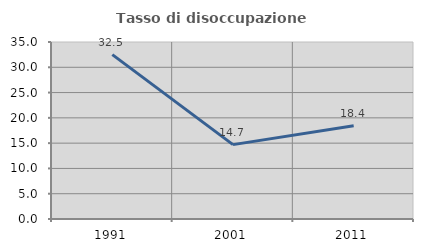
| Category | Tasso di disoccupazione giovanile  |
|---|---|
| 1991.0 | 32.5 |
| 2001.0 | 14.706 |
| 2011.0 | 18.421 |